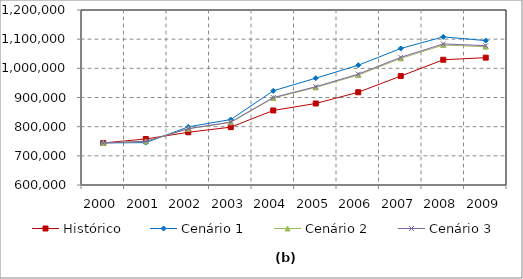
| Category | Histórico | Cenário 1 | Cenário 2 | Cenário 3 |
|---|---|---|---|---|
| 2000.0 | 744169 | 744169 | 744169 | 744169 |
| 2001.0 | 757743.94 | 745337.27 | 749702.724 | 749493.427 |
| 2002.0 | 780768.232 | 799357.681 | 792823.171 | 793141.918 |
| 2003.0 | 798351.9 | 824365.944 | 815035.055 | 815655.094 |
| 2004.0 | 855540.903 | 922955.76 | 898164.352 | 899795.99 |
| 2005.0 | 879468.728 | 966202.874 | 934623.428 | 936974.325 |
| 2006.0 | 918023.074 | 1010650.68 | 977083.647 | 980130.45 |
| 2007.0 | 973496.706 | 1068088.098 | 1033993.782 | 1037697.599 |
| 2008.0 | 1029403.729 | 1107853.176 | 1079915.125 | 1083761.997 |
| 2009.0 | 1036636.945 | 1095103.106 | 1074304.871 | 1077671.286 |